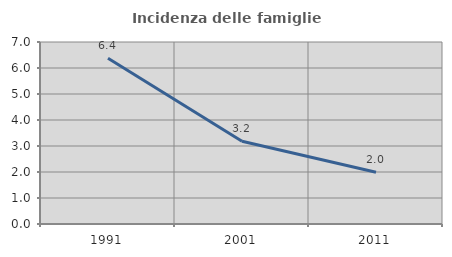
| Category | Incidenza delle famiglie numerose |
|---|---|
| 1991.0 | 6.376 |
| 2001.0 | 3.186 |
| 2011.0 | 1.988 |